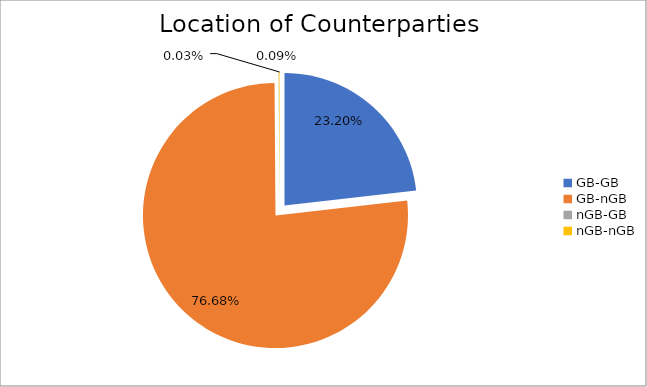
| Category | Series 0 |
|---|---|
| GB-GB | 2955471.782 |
| GB-nGB | 9767845.498 |
| nGB-GB | 3209.307 |
| nGB-nGB | 11498.356 |